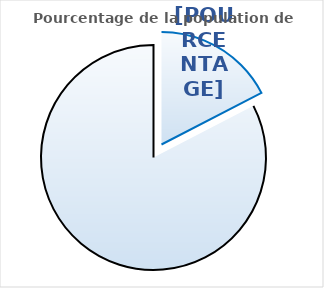
| Category | Series 0 |
|---|---|
| 0 | 5554642 |
| 1 | 26351137 |